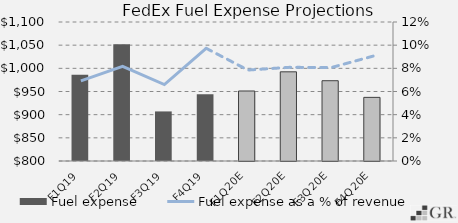
| Category | Fuel expense |
|---|---|
|  F1Q19  | 986 |
|  F2Q19  | 1052 |
|  F3Q19  | 907 |
|  F4Q19  | 944 |
|  F1Q20E  | 951.079 |
|  F2Q20E  | 992.462 |
|  F3Q20E  | 973.277 |
|  F4Q20E  | 937.323 |